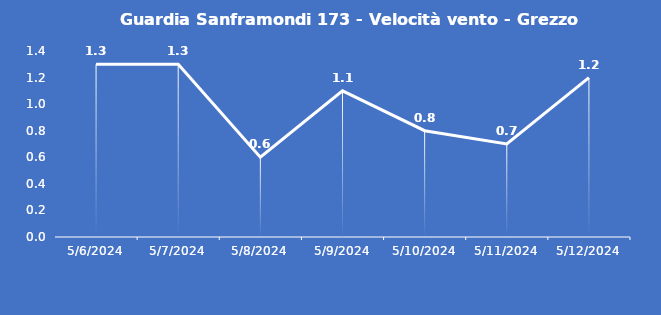
| Category | Guardia Sanframondi 173 - Velocità vento - Grezzo (m/s) |
|---|---|
| 5/6/24 | 1.3 |
| 5/7/24 | 1.3 |
| 5/8/24 | 0.6 |
| 5/9/24 | 1.1 |
| 5/10/24 | 0.8 |
| 5/11/24 | 0.7 |
| 5/12/24 | 1.2 |